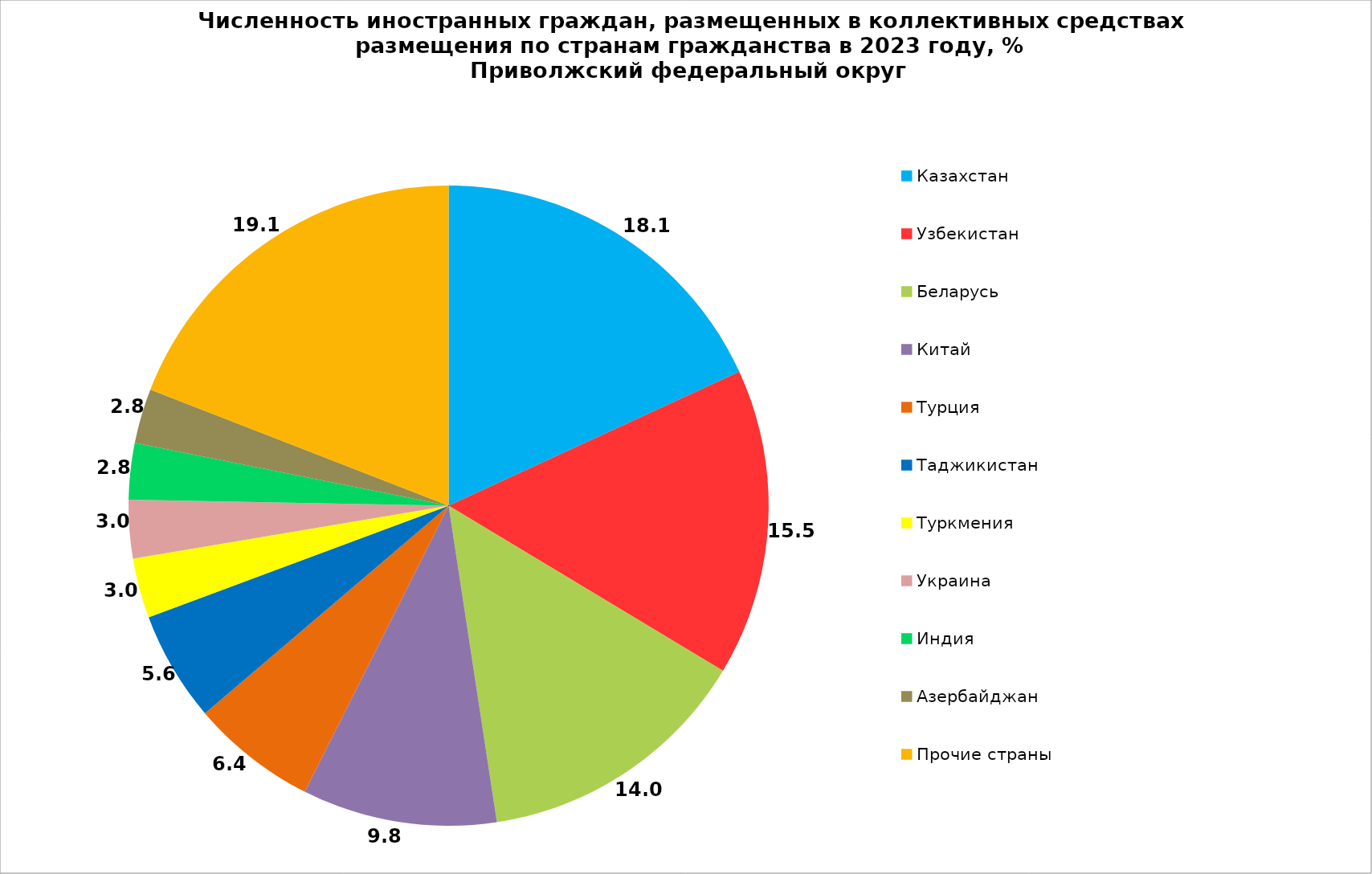
| Category | Series 0 |
|---|---|
| Казахстан | 18.127 |
| Узбекистан | 15.491 |
| Беларусь | 13.971 |
| Китай | 9.828 |
| Турция | 6.352 |
| Таджикистан | 5.557 |
| Туркмения | 3.026 |
| Украина | 2.95 |
| Индия | 2.843 |
| Азербайджан | 2.762 |
| Прочие страны | 19.092 |